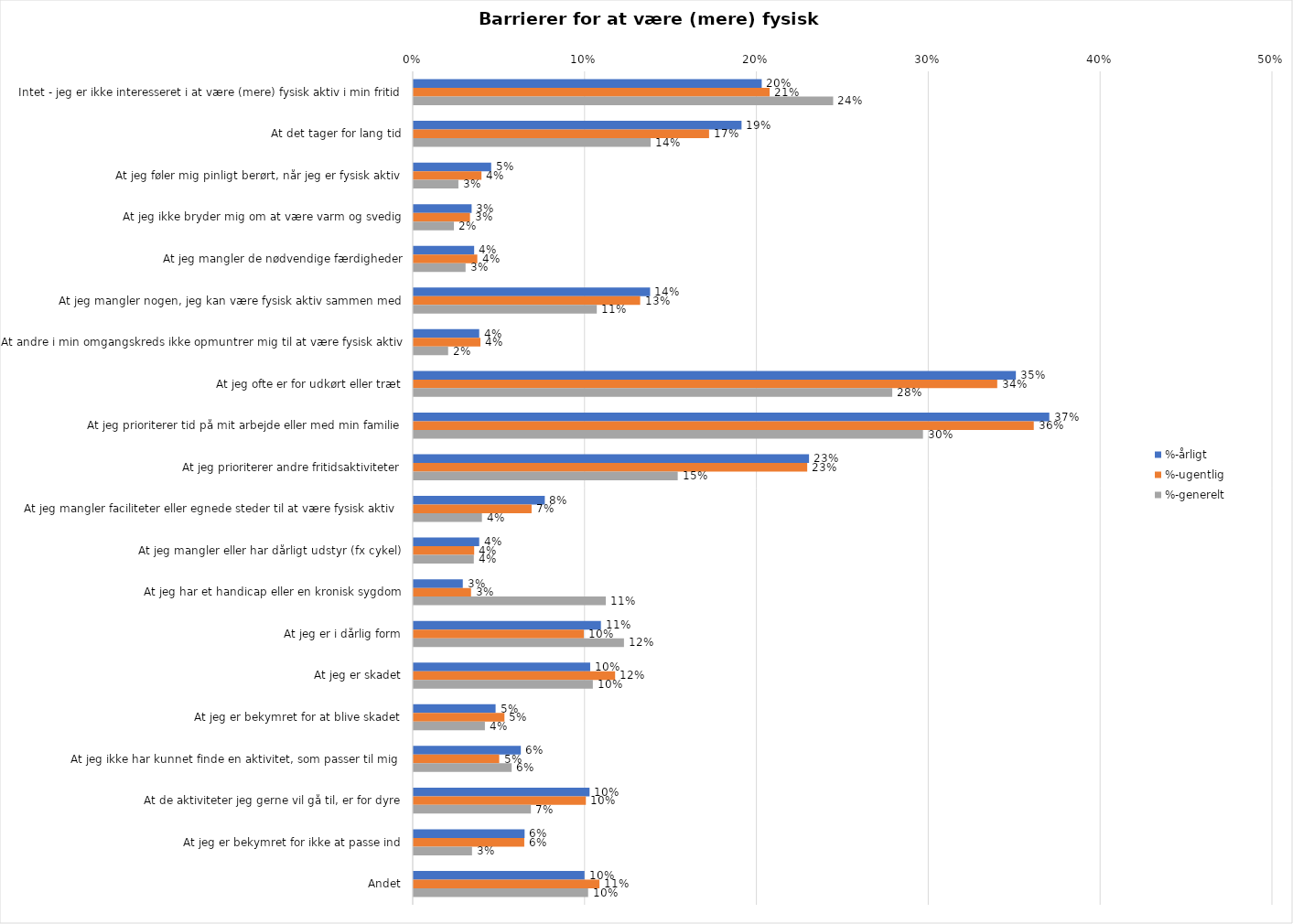
| Category | %-årligt | %-ugentlig | %-generelt |
|---|---|---|---|
| Intet - jeg er ikke interesseret i at være (mere) fysisk aktiv i min fritid | 0.203 | 0.207 | 0.244 |
| At det tager for lang tid | 0.191 | 0.172 | 0.138 |
| At jeg føler mig pinligt berørt, når jeg er fysisk aktiv | 0.045 | 0.039 | 0.026 |
| At jeg ikke bryder mig om at være varm og svedig | 0.034 | 0.033 | 0.023 |
| At jeg mangler de nødvendige færdigheder | 0.035 | 0.037 | 0.03 |
| At jeg mangler nogen, jeg kan være fysisk aktiv sammen med | 0.138 | 0.132 | 0.107 |
| At andre i min omgangskreds ikke opmuntrer mig til at være fysisk aktiv | 0.038 | 0.039 | 0.02 |
| At jeg ofte er for udkørt eller træt | 0.35 | 0.34 | 0.279 |
| At jeg prioriterer tid på mit arbejde eller med min familie | 0.37 | 0.361 | 0.296 |
| At jeg prioriterer andre fritidsaktiviteter | 0.23 | 0.229 | 0.154 |
| At jeg mangler faciliteter eller egnede steder til at være fysisk aktiv  | 0.076 | 0.069 | 0.04 |
| At jeg mangler eller har dårligt udstyr (fx cykel) | 0.038 | 0.035 | 0.035 |
| At jeg har et handicap eller en kronisk sygdom | 0.029 | 0.033 | 0.112 |
| At jeg er i dårlig form | 0.109 | 0.099 | 0.122 |
| At jeg er skadet | 0.103 | 0.117 | 0.104 |
| At jeg er bekymret for at blive skadet | 0.048 | 0.053 | 0.041 |
| At jeg ikke har kunnet finde en aktivitet, som passer til mig  | 0.062 | 0.05 | 0.057 |
| At de aktiviteter jeg gerne vil gå til, er for dyre | 0.102 | 0.1 | 0.068 |
| At jeg er bekymret for ikke at passe ind | 0.065 | 0.064 | 0.034 |
| Andet | 0.099 | 0.108 | 0.102 |